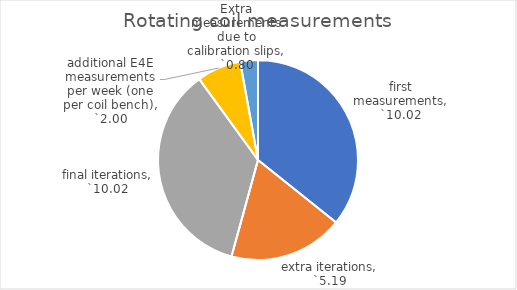
| Category | Rotating coil measurements |
|---|---|
| first measurements | 10.019 |
| extra iterations | 5.195 |
| final iterations | 10.019 |
| additional E4E measurements per week (one per coil bench) | 2 |
| Extra measurements due to calibration slips | 0.802 |